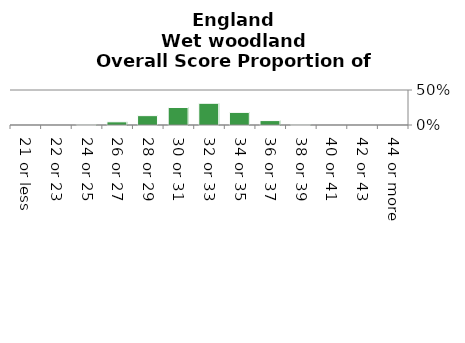
| Category | Wet woodland |
|---|---|
| 21 or less | 0 |
| 22 or 23 | 0 |
| 24 or 25 | 0.009 |
| 26 or 27 | 0.045 |
| 28 or 29 | 0.134 |
| 30 or 31 | 0.25 |
| 32 or 33 | 0.31 |
| 34 or 35 | 0.18 |
| 36 or 37 | 0.063 |
| 38 or 39 | 0.008 |
| 40 or 41 | 0 |
| 42 or 43 | 0 |
| 44 or more | 0 |